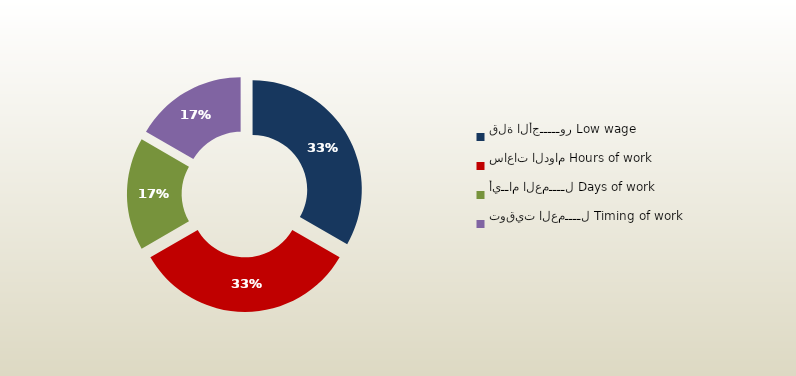
| Category | المجموع
Total |
|---|---|
| قلة الأجـــــور Low wage | 114 |
| ساعات الدوام Hours of work | 114 |
| أيــام العمــــل Days of work | 57 |
| توقيت العمــــل Timing of work | 57 |